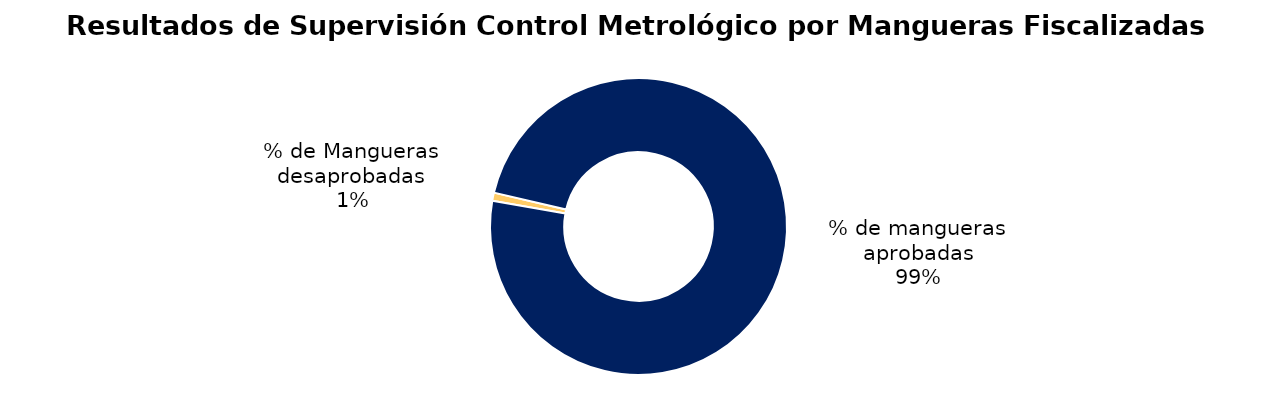
| Category | Series 0 |
|---|---|
| % de Mangueras desaprobadas | 65 |
| % de mangueras aprobadas | 7262 |